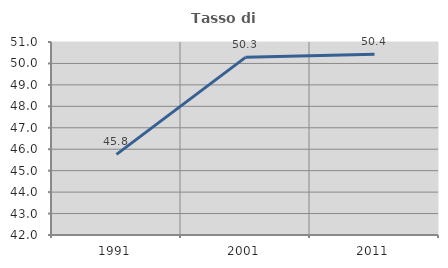
| Category | Tasso di occupazione   |
|---|---|
| 1991.0 | 45.761 |
| 2001.0 | 50.284 |
| 2011.0 | 50.429 |